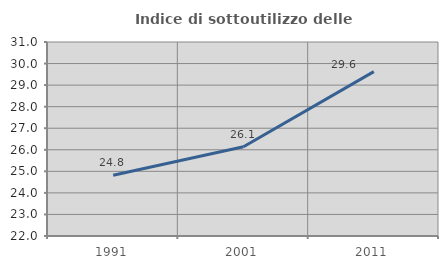
| Category | Indice di sottoutilizzo delle abitazioni  |
|---|---|
| 1991.0 | 24.815 |
| 2001.0 | 26.137 |
| 2011.0 | 29.627 |